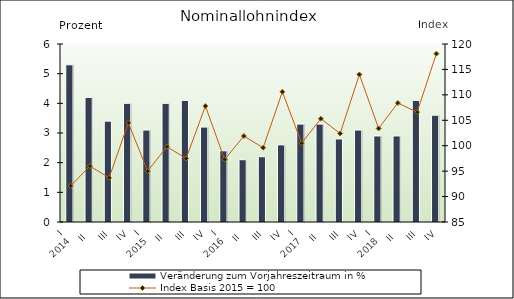
| Category | Veränderung zum Vorjahreszeitraum in % |
|---|---|
| 0 | 5.3 |
| 1 | 4.2 |
| 2 | 3.4 |
| 3 | 4 |
| 4 | 3.1 |
| 5 | 4 |
| 6 | 4.1 |
| 7 | 3.2 |
| 8 | 2.4 |
| 9 | 2.1 |
| 10 | 2.2 |
| 11 | 2.6 |
| 12 | 3.3 |
| 13 | 3.3 |
| 14 | 2.8 |
| 15 | 3.1 |
| 16 | 2.9 |
| 17 | 2.9 |
| 18 | 4.1 |
| 19 | 3.6 |